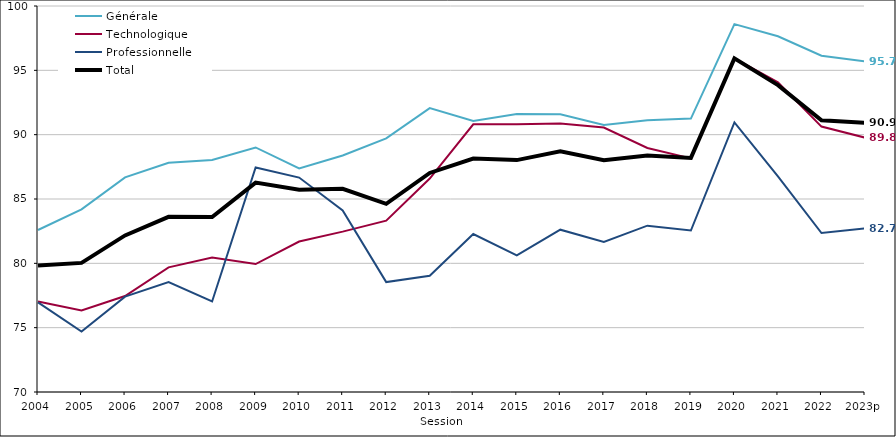
| Category | Générale | Technologique | Professionnelle | Total |
|---|---|---|---|---|
| 2004 | 82.591 | 77.039 | 76.965 | 79.839 |
| 2005 | 84.193 | 76.33 | 74.701 | 80.034 |
| 2006 | 86.68 | 77.457 | 77.412 | 82.17 |
| 2007 | 87.822 | 79.686 | 78.547 | 83.612 |
| 2008 | 88.033 | 80.448 | 77.034 | 83.597 |
| 2009 | 89.007 | 79.947 | 87.445 | 86.275 |
| 2010 | 87.37 | 81.696 | 86.666 | 85.721 |
| 2011 | 88.386 | 82.466 | 84.115 | 85.793 |
| 2012 | 89.717 | 83.319 | 78.543 | 84.62 |
| 2013 | 92.061 | 86.592 | 79.029 | 87.024 |
| 2014 | 91.06 | 90.805 | 82.279 | 88.144 |
| 2015 | 91.598 | 90.808 | 80.617 | 88.024 |
| 2016 | 91.588 | 90.875 | 82.616 | 88.716 |
| 2017 | 90.747 | 90.555 | 81.662 | 88.011 |
| 2018 | 91.128 | 88.966 | 82.928 | 88.376 |
| 2019 | 91.253 | 88.152 | 82.551 | 88.196 |
| 2020 | 98.592 | 95.925 | 90.947 | 95.929 |
| 2021 | 97.647 | 94.077 | 86.76 | 93.852 |
| 2022 | 96.136 | 90.628 | 82.354 | 91.126 |
| 2023p | 95.693 | 89.768 | 82.708 | 90.922 |